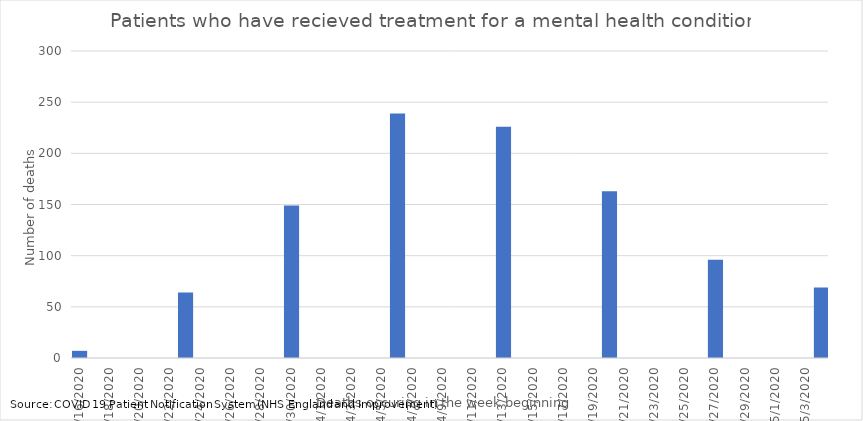
| Category | Number of cases |
|---|---|
| 3/16/20 | 7 |
| 3/23/20 | 64 |
| 3/30/20 | 149 |
| 4/6/20 | 239 |
| 4/13/20 | 226 |
| 4/20/20 | 163 |
| 4/27/20 | 96 |
| 5/4/20 | 69 |